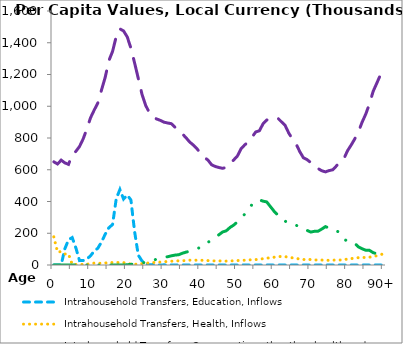
| Category | Intrahousehold Transfers, Education, Inflows | Intrahousehold Transfers, Health, Inflows | Intrahousehold Transfers, Consumption other than health and education, Inflows | Intrahousehold Transfers, Saving, Inflows |
|---|---|---|---|---|
| 0 | 0 | 177311.174 | 649907.917 | 0 |
|  | 0 | 81301.837 | 636320.757 | 0 |
| 2 | 0 | 84682.875 | 660463.387 | 0 |
| 3 | 102368.864 | 69316.724 | 643515.039 | 0 |
| 4 | 158965.581 | 69406.141 | 633821.076 | 0 |
| 5 | 172931.153 | 4021.906 | 695165.816 | 0 |
| 6 | 108250.604 | 3704.143 | 716100.189 | 0 |
| 7 | 27603.545 | 3771.159 | 746485.847 | 0 |
| 8 | 28159.762 | 3895.046 | 794830.784 | 0 |
| 9 | 37383.904 | 3603.841 | 857596.64 | 0 |
| 10 | 58354.5 | 10576.66 | 927462.667 | 0 |
| 11 | 87111.365 | 11897.361 | 976055.667 | 0 |
| 12 | 105990.319 | 11168.584 | 1020920.5 | 0 |
| 13 | 145639.148 | 10777.148 | 1103383.895 | 0 |
| 14 | 193859.762 | 12464.631 | 1182697.312 | 0 |
| 15 | 234743.174 | 16272.586 | 1287640.556 | 0 |
| 16 | 254968.75 | 15136.82 | 1345294.102 | 0 |
| 17 | 416994.64 | 15890.99 | 1439257.291 | 0 |
| 18 | 475549.171 | 15184.405 | 1487289.954 | 0 |
| 19 | 415588.573 | 15159.152 | 1474434.696 | 0 |
| 20 | 440407.713 | 8811.874 | 1436764.553 | 1412.049 |
| 21 | 409420.76 | 6523.533 | 1366310.756 | 3821.698 |
| 22 | 211692.966 | 4009.026 | 1273145.926 | 6752.697 |
| 23 | 62399.765 | 6545.125 | 1176279.563 | 9711.071 |
| 24 | 26088.039 | 8648.699 | 1076994.46 | 12318.934 |
| 25 | 11430.393 | 11187.109 | 1006397.114 | 17767.782 |
| 26 | 881.175 | 12904.606 | 960890.85 | 22789.879 |
| 27 | 2822.735 | 15181.303 | 930606.869 | 28549.991 |
| 28 | 534.975 | 16999.399 | 919948.39 | 36668.992 |
| 29 | 43.856 | 18311.4 | 911128.021 | 45223.155 |
| 30 | 961.555 | 20273.518 | 899756.97 | 48729.399 |
| 31 | 0 | 22451.276 | 894659.673 | 52035.227 |
| 32 | 741.451 | 24086.452 | 890299.384 | 57740.559 |
| 33 | 140.356 | 24826.749 | 868267.144 | 62394.929 |
| 34 | 406.929 | 26288 | 852331.212 | 64586.207 |
| 35 | 0 | 26662.338 | 826497.929 | 73747.881 |
| 36 | 133.952 | 28361.097 | 801944.325 | 81056.894 |
| 37 | 51.828 | 30470.395 | 775114.598 | 86491.199 |
| 38 | 0 | 30295.144 | 755580.408 | 94013.589 |
| 39 | 0 | 30341.323 | 732254.766 | 103125.055 |
| 40 | 0 | 29736.063 | 702562.703 | 110812.017 |
| 41 | 0 | 29305.437 | 678460.868 | 123249.515 |
| 42 | 0 | 27802.117 | 660681.17 | 143958.625 |
| 43 | 0 | 26505.254 | 631009.631 | 154396.474 |
| 44 | 0 | 25835.332 | 620508.432 | 172807.365 |
| 45 | 85.751 | 26118.61 | 613956.987 | 190993.579 |
| 46 | 0 | 24791.355 | 608902.124 | 208224.092 |
| 47 | 0 | 24514.88 | 615564.06 | 215838.618 |
| 48 | 0 | 26026.925 | 641277.488 | 236432.029 |
| 49 | 0 | 26505.512 | 661416.69 | 251429.357 |
| 50 | 0 | 27979.778 | 686171.359 | 271033.114 |
| 51 | 942.483 | 29277.079 | 732026.193 | 297052.981 |
| 52 | 92.229 | 30120.189 | 756440.389 | 319852.27 |
| 53 | 5.467 | 31315.74 | 776219.964 | 343419.893 |
| 54 | 0 | 33444.145 | 805647.592 | 382661.924 |
| 55 | 0 | 34077.238 | 838047.95 | 403055.684 |
| 56 | 0 | 36222.471 | 845458.947 | 410204.196 |
| 57 | 0 | 39578.956 | 889189.626 | 402280.33 |
| 58 | 78.736 | 43121.831 | 913380.518 | 397339.528 |
| 59 | 0 | 45729.417 | 915045.179 | 368195.856 |
| 60 | 0 | 48899.168 | 917329.168 | 338874.463 |
| 61 | 0 | 52239.727 | 925340.22 | 314994.998 |
| 62 | 0 | 53819.651 | 902227.845 | 304465.66 |
| 63 | 0 | 52444.574 | 879858.164 | 276373.191 |
| 64 | 0 | 48631.259 | 831342.115 | 263408.397 |
| 65 | 0.048 | 45341.834 | 793893.351 | 261443.752 |
| 66 | 3.929 | 41998.018 | 762874.071 | 250949.731 |
| 67 | 6.408 | 37383.62 | 714480.159 | 236023.834 |
| 68 | 0 | 34519.284 | 675274.997 | 227211.914 |
| 69 | 0 | 34907.988 | 663713.265 | 217807.823 |
| 70 | 0 | 34518.874 | 645266.493 | 207456.145 |
| 71 | 0 | 31911.89 | 620455.235 | 212266.128 |
| 72 | 0 | 31276.492 | 607187.184 | 213001.803 |
| 73 | 0 | 31116.588 | 593741.683 | 226372.742 |
| 74 | 0 | 29922.875 | 586676.686 | 241687.834 |
| 75 | 0 | 29443.771 | 594591.058 | 232899.469 |
| 76 | 0 | 30568.897 | 599927.33 | 229418.477 |
| 77 | 0 | 31005.233 | 624208.131 | 215990.178 |
| 78 | 0 | 31512.323 | 650280.352 | 201092.348 |
| 79 | 0 | 33320.573 | 668156.568 | 164172.643 |
| 80 | 0 | 37638.433 | 719209.334 | 149169.721 |
| 81 | 0 | 40317.836 | 755215.547 | 135231.295 |
| 82 | 0 | 42948.351 | 794629.874 | 136201.763 |
| 83 | 0 | 46360.831 | 839907.291 | 113789.667 |
| 84 | 0 | 47623.161 | 900226.251 | 102288.78 |
| 85 | 0 | 47062.518 | 951351.561 | 92738.06 |
| 86 | 0 | 49120.549 | 1015977.306 | 92236.872 |
| 87 | 0 | 53641.668 | 1093763.189 | 77835.023 |
| 88 | 0 | 58351.588 | 1145637.471 | 70453.275 |
| 89 | 0 | 65056.998 | 1198697.915 | 67210.881 |
| 90+ | 0 | 71762.408 | 1251758.359 | 63968.487 |